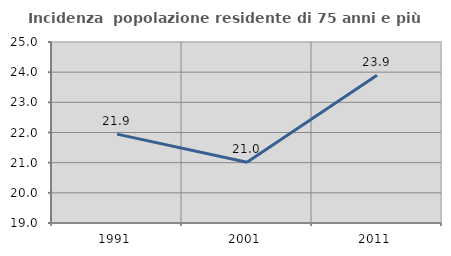
| Category | Incidenza  popolazione residente di 75 anni e più |
|---|---|
| 1991.0 | 21.946 |
| 2001.0 | 21.016 |
| 2011.0 | 23.898 |